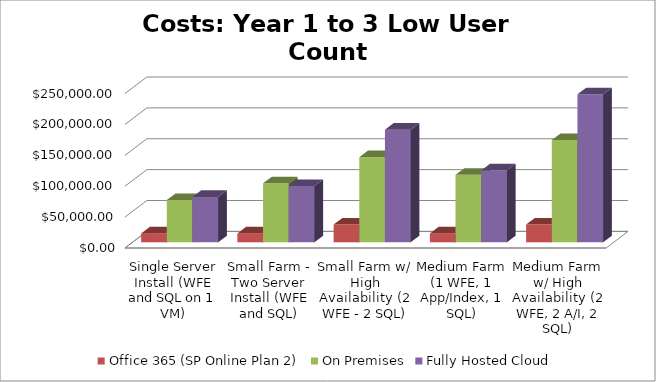
| Category | Office 365 (SP Online Plan 2) | On Premises | Fully Hosted Cloud |
|---|---|---|---|
| Single Server Install (WFE and SQL on 1 VM) | 14400 | 68391.62 | 73470 |
| Small Farm - Two Server Install (WFE and SQL) | 14400 | 95504.256 | 91110 |
| Small Farm w/ High Availability (2 WFE - 2 SQL) | 28800 | 137856.541 | 182400 |
| Medium Farm (1 WFE, 1 App/Index, 1 SQL) | 14400 | 109329.517 | 116310 |
| Medium Farm w/ High Availability (2 WFE, 2 A/I, 2 SQL) | 28800 | 165596.197 | 239640 |